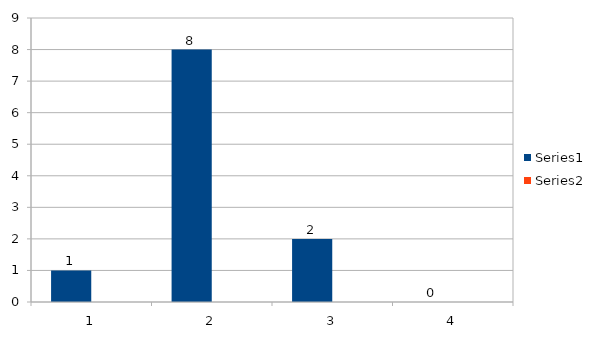
| Category | Series 0 | Series 1 |
|---|---|---|
| 0 | 1 |  |
| 1 | 8 |  |
| 2 | 2 |  |
| 3 | 0 |  |